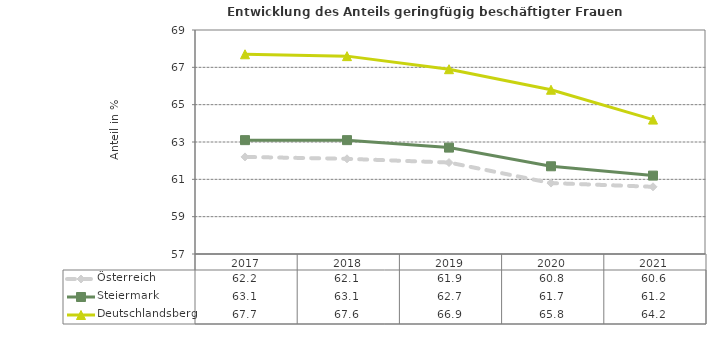
| Category | Österreich | Steiermark | Deutschlandsberg |
|---|---|---|---|
| 2021.0 | 60.6 | 61.2 | 64.2 |
| 2020.0 | 60.8 | 61.7 | 65.8 |
| 2019.0 | 61.9 | 62.7 | 66.9 |
| 2018.0 | 62.1 | 63.1 | 67.6 |
| 2017.0 | 62.2 | 63.1 | 67.7 |